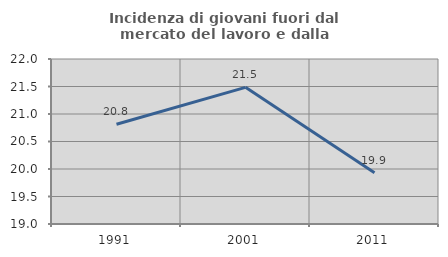
| Category | Incidenza di giovani fuori dal mercato del lavoro e dalla formazione  |
|---|---|
| 1991.0 | 20.814 |
| 2001.0 | 21.485 |
| 2011.0 | 19.93 |